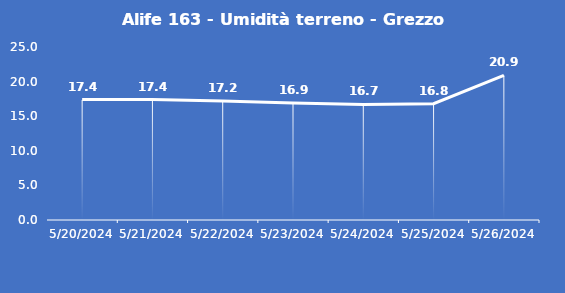
| Category | Alife 163 - Umidità terreno - Grezzo (%VWC) |
|---|---|
| 5/20/24 | 17.4 |
| 5/21/24 | 17.4 |
| 5/22/24 | 17.2 |
| 5/23/24 | 16.9 |
| 5/24/24 | 16.7 |
| 5/25/24 | 16.8 |
| 5/26/24 | 20.9 |